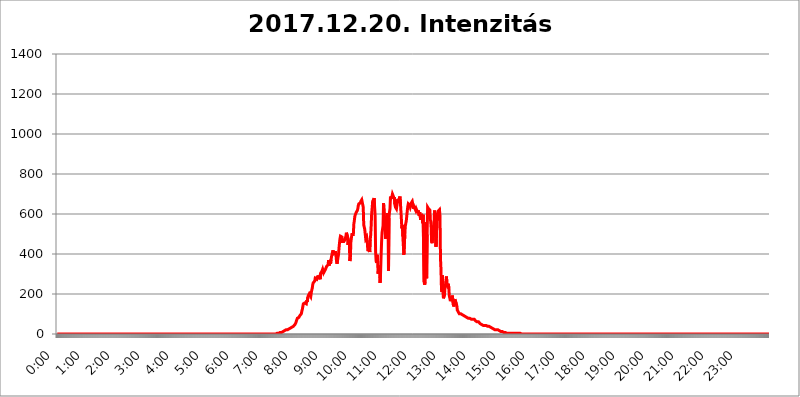
| Category | 2017.12.20. Intenzitás [W/m^2] |
|---|---|
| 0.0 | 0 |
| 0.0006944444444444445 | 0 |
| 0.001388888888888889 | 0 |
| 0.0020833333333333333 | 0 |
| 0.002777777777777778 | 0 |
| 0.003472222222222222 | 0 |
| 0.004166666666666667 | 0 |
| 0.004861111111111111 | 0 |
| 0.005555555555555556 | 0 |
| 0.0062499999999999995 | 0 |
| 0.006944444444444444 | 0 |
| 0.007638888888888889 | 0 |
| 0.008333333333333333 | 0 |
| 0.009027777777777779 | 0 |
| 0.009722222222222222 | 0 |
| 0.010416666666666666 | 0 |
| 0.011111111111111112 | 0 |
| 0.011805555555555555 | 0 |
| 0.012499999999999999 | 0 |
| 0.013194444444444444 | 0 |
| 0.013888888888888888 | 0 |
| 0.014583333333333332 | 0 |
| 0.015277777777777777 | 0 |
| 0.015972222222222224 | 0 |
| 0.016666666666666666 | 0 |
| 0.017361111111111112 | 0 |
| 0.018055555555555557 | 0 |
| 0.01875 | 0 |
| 0.019444444444444445 | 0 |
| 0.02013888888888889 | 0 |
| 0.020833333333333332 | 0 |
| 0.02152777777777778 | 0 |
| 0.022222222222222223 | 0 |
| 0.02291666666666667 | 0 |
| 0.02361111111111111 | 0 |
| 0.024305555555555556 | 0 |
| 0.024999999999999998 | 0 |
| 0.025694444444444447 | 0 |
| 0.02638888888888889 | 0 |
| 0.027083333333333334 | 0 |
| 0.027777777777777776 | 0 |
| 0.02847222222222222 | 0 |
| 0.029166666666666664 | 0 |
| 0.029861111111111113 | 0 |
| 0.030555555555555555 | 0 |
| 0.03125 | 0 |
| 0.03194444444444445 | 0 |
| 0.03263888888888889 | 0 |
| 0.03333333333333333 | 0 |
| 0.034027777777777775 | 0 |
| 0.034722222222222224 | 0 |
| 0.035416666666666666 | 0 |
| 0.036111111111111115 | 0 |
| 0.03680555555555556 | 0 |
| 0.0375 | 0 |
| 0.03819444444444444 | 0 |
| 0.03888888888888889 | 0 |
| 0.03958333333333333 | 0 |
| 0.04027777777777778 | 0 |
| 0.04097222222222222 | 0 |
| 0.041666666666666664 | 0 |
| 0.042361111111111106 | 0 |
| 0.04305555555555556 | 0 |
| 0.043750000000000004 | 0 |
| 0.044444444444444446 | 0 |
| 0.04513888888888889 | 0 |
| 0.04583333333333334 | 0 |
| 0.04652777777777778 | 0 |
| 0.04722222222222222 | 0 |
| 0.04791666666666666 | 0 |
| 0.04861111111111111 | 0 |
| 0.049305555555555554 | 0 |
| 0.049999999999999996 | 0 |
| 0.05069444444444445 | 0 |
| 0.051388888888888894 | 0 |
| 0.052083333333333336 | 0 |
| 0.05277777777777778 | 0 |
| 0.05347222222222222 | 0 |
| 0.05416666666666667 | 0 |
| 0.05486111111111111 | 0 |
| 0.05555555555555555 | 0 |
| 0.05625 | 0 |
| 0.05694444444444444 | 0 |
| 0.057638888888888885 | 0 |
| 0.05833333333333333 | 0 |
| 0.05902777777777778 | 0 |
| 0.059722222222222225 | 0 |
| 0.06041666666666667 | 0 |
| 0.061111111111111116 | 0 |
| 0.06180555555555556 | 0 |
| 0.0625 | 0 |
| 0.06319444444444444 | 0 |
| 0.06388888888888888 | 0 |
| 0.06458333333333334 | 0 |
| 0.06527777777777778 | 0 |
| 0.06597222222222222 | 0 |
| 0.06666666666666667 | 0 |
| 0.06736111111111111 | 0 |
| 0.06805555555555555 | 0 |
| 0.06874999999999999 | 0 |
| 0.06944444444444443 | 0 |
| 0.07013888888888889 | 0 |
| 0.07083333333333333 | 0 |
| 0.07152777777777779 | 0 |
| 0.07222222222222223 | 0 |
| 0.07291666666666667 | 0 |
| 0.07361111111111111 | 0 |
| 0.07430555555555556 | 0 |
| 0.075 | 0 |
| 0.07569444444444444 | 0 |
| 0.0763888888888889 | 0 |
| 0.07708333333333334 | 0 |
| 0.07777777777777778 | 0 |
| 0.07847222222222222 | 0 |
| 0.07916666666666666 | 0 |
| 0.0798611111111111 | 0 |
| 0.08055555555555556 | 0 |
| 0.08125 | 0 |
| 0.08194444444444444 | 0 |
| 0.08263888888888889 | 0 |
| 0.08333333333333333 | 0 |
| 0.08402777777777777 | 0 |
| 0.08472222222222221 | 0 |
| 0.08541666666666665 | 0 |
| 0.08611111111111112 | 0 |
| 0.08680555555555557 | 0 |
| 0.08750000000000001 | 0 |
| 0.08819444444444445 | 0 |
| 0.08888888888888889 | 0 |
| 0.08958333333333333 | 0 |
| 0.09027777777777778 | 0 |
| 0.09097222222222222 | 0 |
| 0.09166666666666667 | 0 |
| 0.09236111111111112 | 0 |
| 0.09305555555555556 | 0 |
| 0.09375 | 0 |
| 0.09444444444444444 | 0 |
| 0.09513888888888888 | 0 |
| 0.09583333333333333 | 0 |
| 0.09652777777777777 | 0 |
| 0.09722222222222222 | 0 |
| 0.09791666666666667 | 0 |
| 0.09861111111111111 | 0 |
| 0.09930555555555555 | 0 |
| 0.09999999999999999 | 0 |
| 0.10069444444444443 | 0 |
| 0.1013888888888889 | 0 |
| 0.10208333333333335 | 0 |
| 0.10277777777777779 | 0 |
| 0.10347222222222223 | 0 |
| 0.10416666666666667 | 0 |
| 0.10486111111111111 | 0 |
| 0.10555555555555556 | 0 |
| 0.10625 | 0 |
| 0.10694444444444444 | 0 |
| 0.1076388888888889 | 0 |
| 0.10833333333333334 | 0 |
| 0.10902777777777778 | 0 |
| 0.10972222222222222 | 0 |
| 0.1111111111111111 | 0 |
| 0.11180555555555556 | 0 |
| 0.11180555555555556 | 0 |
| 0.1125 | 0 |
| 0.11319444444444444 | 0 |
| 0.11388888888888889 | 0 |
| 0.11458333333333333 | 0 |
| 0.11527777777777777 | 0 |
| 0.11597222222222221 | 0 |
| 0.11666666666666665 | 0 |
| 0.1173611111111111 | 0 |
| 0.11805555555555557 | 0 |
| 0.11944444444444445 | 0 |
| 0.12013888888888889 | 0 |
| 0.12083333333333333 | 0 |
| 0.12152777777777778 | 0 |
| 0.12222222222222223 | 0 |
| 0.12291666666666667 | 0 |
| 0.12291666666666667 | 0 |
| 0.12361111111111112 | 0 |
| 0.12430555555555556 | 0 |
| 0.125 | 0 |
| 0.12569444444444444 | 0 |
| 0.12638888888888888 | 0 |
| 0.12708333333333333 | 0 |
| 0.16875 | 0 |
| 0.12847222222222224 | 0 |
| 0.12916666666666668 | 0 |
| 0.12986111111111112 | 0 |
| 0.13055555555555556 | 0 |
| 0.13125 | 0 |
| 0.13194444444444445 | 0 |
| 0.1326388888888889 | 0 |
| 0.13333333333333333 | 0 |
| 0.13402777777777777 | 0 |
| 0.13402777777777777 | 0 |
| 0.13472222222222222 | 0 |
| 0.13541666666666666 | 0 |
| 0.1361111111111111 | 0 |
| 0.13749999999999998 | 0 |
| 0.13819444444444443 | 0 |
| 0.1388888888888889 | 0 |
| 0.13958333333333334 | 0 |
| 0.14027777777777778 | 0 |
| 0.14097222222222222 | 0 |
| 0.14166666666666666 | 0 |
| 0.1423611111111111 | 0 |
| 0.14305555555555557 | 0 |
| 0.14375000000000002 | 0 |
| 0.14444444444444446 | 0 |
| 0.1451388888888889 | 0 |
| 0.1451388888888889 | 0 |
| 0.14652777777777778 | 0 |
| 0.14722222222222223 | 0 |
| 0.14791666666666667 | 0 |
| 0.1486111111111111 | 0 |
| 0.14930555555555555 | 0 |
| 0.15 | 0 |
| 0.15069444444444444 | 0 |
| 0.15138888888888888 | 0 |
| 0.15208333333333332 | 0 |
| 0.15277777777777776 | 0 |
| 0.15347222222222223 | 0 |
| 0.15416666666666667 | 0 |
| 0.15486111111111112 | 0 |
| 0.15555555555555556 | 0 |
| 0.15625 | 0 |
| 0.15694444444444444 | 0 |
| 0.15763888888888888 | 0 |
| 0.15833333333333333 | 0 |
| 0.15902777777777777 | 0 |
| 0.15972222222222224 | 0 |
| 0.16041666666666668 | 0 |
| 0.16111111111111112 | 0 |
| 0.16180555555555556 | 0 |
| 0.1625 | 0 |
| 0.16319444444444445 | 0 |
| 0.1638888888888889 | 0 |
| 0.16458333333333333 | 0 |
| 0.16527777777777777 | 0 |
| 0.16597222222222222 | 0 |
| 0.16666666666666666 | 0 |
| 0.1673611111111111 | 0 |
| 0.16805555555555554 | 0 |
| 0.16874999999999998 | 0 |
| 0.16944444444444443 | 0 |
| 0.17013888888888887 | 0 |
| 0.1708333333333333 | 0 |
| 0.17152777777777775 | 0 |
| 0.17222222222222225 | 0 |
| 0.1729166666666667 | 0 |
| 0.17361111111111113 | 0 |
| 0.17430555555555557 | 0 |
| 0.17500000000000002 | 0 |
| 0.17569444444444446 | 0 |
| 0.1763888888888889 | 0 |
| 0.17708333333333334 | 0 |
| 0.17777777777777778 | 0 |
| 0.17847222222222223 | 0 |
| 0.17916666666666667 | 0 |
| 0.1798611111111111 | 0 |
| 0.18055555555555555 | 0 |
| 0.18125 | 0 |
| 0.18194444444444444 | 0 |
| 0.1826388888888889 | 0 |
| 0.18333333333333335 | 0 |
| 0.1840277777777778 | 0 |
| 0.18472222222222223 | 0 |
| 0.18541666666666667 | 0 |
| 0.18611111111111112 | 0 |
| 0.18680555555555556 | 0 |
| 0.1875 | 0 |
| 0.18819444444444444 | 0 |
| 0.18888888888888888 | 0 |
| 0.18958333333333333 | 0 |
| 0.19027777777777777 | 0 |
| 0.1909722222222222 | 0 |
| 0.19166666666666665 | 0 |
| 0.19236111111111112 | 0 |
| 0.19305555555555554 | 0 |
| 0.19375 | 0 |
| 0.19444444444444445 | 0 |
| 0.1951388888888889 | 0 |
| 0.19583333333333333 | 0 |
| 0.19652777777777777 | 0 |
| 0.19722222222222222 | 0 |
| 0.19791666666666666 | 0 |
| 0.1986111111111111 | 0 |
| 0.19930555555555554 | 0 |
| 0.19999999999999998 | 0 |
| 0.20069444444444443 | 0 |
| 0.20138888888888887 | 0 |
| 0.2020833333333333 | 0 |
| 0.2027777777777778 | 0 |
| 0.2034722222222222 | 0 |
| 0.2041666666666667 | 0 |
| 0.20486111111111113 | 0 |
| 0.20555555555555557 | 0 |
| 0.20625000000000002 | 0 |
| 0.20694444444444446 | 0 |
| 0.2076388888888889 | 0 |
| 0.20833333333333334 | 0 |
| 0.20902777777777778 | 0 |
| 0.20972222222222223 | 0 |
| 0.21041666666666667 | 0 |
| 0.2111111111111111 | 0 |
| 0.21180555555555555 | 0 |
| 0.2125 | 0 |
| 0.21319444444444444 | 0 |
| 0.2138888888888889 | 0 |
| 0.21458333333333335 | 0 |
| 0.2152777777777778 | 0 |
| 0.21597222222222223 | 0 |
| 0.21666666666666667 | 0 |
| 0.21736111111111112 | 0 |
| 0.21805555555555556 | 0 |
| 0.21875 | 0 |
| 0.21944444444444444 | 0 |
| 0.22013888888888888 | 0 |
| 0.22083333333333333 | 0 |
| 0.22152777777777777 | 0 |
| 0.2222222222222222 | 0 |
| 0.22291666666666665 | 0 |
| 0.2236111111111111 | 0 |
| 0.22430555555555556 | 0 |
| 0.225 | 0 |
| 0.22569444444444445 | 0 |
| 0.2263888888888889 | 0 |
| 0.22708333333333333 | 0 |
| 0.22777777777777777 | 0 |
| 0.22847222222222222 | 0 |
| 0.22916666666666666 | 0 |
| 0.2298611111111111 | 0 |
| 0.23055555555555554 | 0 |
| 0.23124999999999998 | 0 |
| 0.23194444444444443 | 0 |
| 0.23263888888888887 | 0 |
| 0.2333333333333333 | 0 |
| 0.2340277777777778 | 0 |
| 0.2347222222222222 | 0 |
| 0.2354166666666667 | 0 |
| 0.23611111111111113 | 0 |
| 0.23680555555555557 | 0 |
| 0.23750000000000002 | 0 |
| 0.23819444444444446 | 0 |
| 0.2388888888888889 | 0 |
| 0.23958333333333334 | 0 |
| 0.24027777777777778 | 0 |
| 0.24097222222222223 | 0 |
| 0.24166666666666667 | 0 |
| 0.2423611111111111 | 0 |
| 0.24305555555555555 | 0 |
| 0.24375 | 0 |
| 0.24444444444444446 | 0 |
| 0.24513888888888888 | 0 |
| 0.24583333333333335 | 0 |
| 0.2465277777777778 | 0 |
| 0.24722222222222223 | 0 |
| 0.24791666666666667 | 0 |
| 0.24861111111111112 | 0 |
| 0.24930555555555556 | 0 |
| 0.25 | 0 |
| 0.25069444444444444 | 0 |
| 0.2513888888888889 | 0 |
| 0.2520833333333333 | 0 |
| 0.25277777777777777 | 0 |
| 0.2534722222222222 | 0 |
| 0.25416666666666665 | 0 |
| 0.2548611111111111 | 0 |
| 0.2555555555555556 | 0 |
| 0.25625000000000003 | 0 |
| 0.2569444444444445 | 0 |
| 0.2576388888888889 | 0 |
| 0.25833333333333336 | 0 |
| 0.2590277777777778 | 0 |
| 0.25972222222222224 | 0 |
| 0.2604166666666667 | 0 |
| 0.2611111111111111 | 0 |
| 0.26180555555555557 | 0 |
| 0.2625 | 0 |
| 0.26319444444444445 | 0 |
| 0.2638888888888889 | 0 |
| 0.26458333333333334 | 0 |
| 0.2652777777777778 | 0 |
| 0.2659722222222222 | 0 |
| 0.26666666666666666 | 0 |
| 0.2673611111111111 | 0 |
| 0.26805555555555555 | 0 |
| 0.26875 | 0 |
| 0.26944444444444443 | 0 |
| 0.2701388888888889 | 0 |
| 0.2708333333333333 | 0 |
| 0.27152777777777776 | 0 |
| 0.2722222222222222 | 0 |
| 0.27291666666666664 | 0 |
| 0.2736111111111111 | 0 |
| 0.2743055555555555 | 0 |
| 0.27499999999999997 | 0 |
| 0.27569444444444446 | 0 |
| 0.27638888888888885 | 0 |
| 0.27708333333333335 | 0 |
| 0.2777777777777778 | 0 |
| 0.27847222222222223 | 0 |
| 0.2791666666666667 | 0 |
| 0.2798611111111111 | 0 |
| 0.28055555555555556 | 0 |
| 0.28125 | 0 |
| 0.28194444444444444 | 0 |
| 0.2826388888888889 | 0 |
| 0.2833333333333333 | 0 |
| 0.28402777777777777 | 0 |
| 0.2847222222222222 | 0 |
| 0.28541666666666665 | 0 |
| 0.28611111111111115 | 0 |
| 0.28680555555555554 | 0 |
| 0.28750000000000003 | 0 |
| 0.2881944444444445 | 0 |
| 0.2888888888888889 | 0 |
| 0.28958333333333336 | 0 |
| 0.2902777777777778 | 0 |
| 0.29097222222222224 | 0 |
| 0.2916666666666667 | 0 |
| 0.2923611111111111 | 0 |
| 0.29305555555555557 | 0 |
| 0.29375 | 0 |
| 0.29444444444444445 | 0 |
| 0.2951388888888889 | 0 |
| 0.29583333333333334 | 0 |
| 0.2965277777777778 | 0 |
| 0.2972222222222222 | 0 |
| 0.29791666666666666 | 0 |
| 0.2986111111111111 | 0 |
| 0.29930555555555555 | 0 |
| 0.3 | 0 |
| 0.30069444444444443 | 0 |
| 0.3013888888888889 | 0 |
| 0.3020833333333333 | 0 |
| 0.30277777777777776 | 0 |
| 0.3034722222222222 | 0 |
| 0.30416666666666664 | 0 |
| 0.3048611111111111 | 0 |
| 0.3055555555555555 | 0 |
| 0.30624999999999997 | 0 |
| 0.3069444444444444 | 0 |
| 0.3076388888888889 | 3.525 |
| 0.30833333333333335 | 3.525 |
| 0.3090277777777778 | 3.525 |
| 0.30972222222222223 | 3.525 |
| 0.3104166666666667 | 3.525 |
| 0.3111111111111111 | 3.525 |
| 0.31180555555555556 | 3.525 |
| 0.3125 | 7.887 |
| 0.31319444444444444 | 7.887 |
| 0.3138888888888889 | 7.887 |
| 0.3145833333333333 | 7.887 |
| 0.31527777777777777 | 7.887 |
| 0.3159722222222222 | 12.257 |
| 0.31666666666666665 | 12.257 |
| 0.31736111111111115 | 12.257 |
| 0.31805555555555554 | 12.257 |
| 0.31875000000000003 | 16.636 |
| 0.3194444444444445 | 16.636 |
| 0.3201388888888889 | 16.636 |
| 0.32083333333333336 | 21.024 |
| 0.3215277777777778 | 21.024 |
| 0.32222222222222224 | 21.024 |
| 0.3229166666666667 | 21.024 |
| 0.3236111111111111 | 25.419 |
| 0.32430555555555557 | 25.419 |
| 0.325 | 25.419 |
| 0.32569444444444445 | 29.823 |
| 0.3263888888888889 | 29.823 |
| 0.32708333333333334 | 29.823 |
| 0.3277777777777778 | 29.823 |
| 0.3284722222222222 | 34.234 |
| 0.32916666666666666 | 34.234 |
| 0.3298611111111111 | 38.653 |
| 0.33055555555555555 | 38.653 |
| 0.33125 | 38.653 |
| 0.33194444444444443 | 43.079 |
| 0.3326388888888889 | 43.079 |
| 0.3333333333333333 | 47.511 |
| 0.3340277777777778 | 51.951 |
| 0.3347222222222222 | 56.398 |
| 0.3354166666666667 | 65.31 |
| 0.3361111111111111 | 65.31 |
| 0.3368055555555556 | 78.722 |
| 0.33749999999999997 | 74.246 |
| 0.33819444444444446 | 83.205 |
| 0.33888888888888885 | 83.205 |
| 0.33958333333333335 | 87.692 |
| 0.34027777777777773 | 92.184 |
| 0.34097222222222223 | 92.184 |
| 0.3416666666666666 | 96.682 |
| 0.3423611111111111 | 101.184 |
| 0.3430555555555555 | 114.716 |
| 0.34375 | 123.758 |
| 0.3444444444444445 | 137.347 |
| 0.3451388888888889 | 150.964 |
| 0.3458333333333334 | 155.509 |
| 0.34652777777777777 | 155.509 |
| 0.34722222222222227 | 155.509 |
| 0.34791666666666665 | 155.509 |
| 0.34861111111111115 | 150.964 |
| 0.34930555555555554 | 150.964 |
| 0.35000000000000003 | 169.156 |
| 0.3506944444444444 | 160.056 |
| 0.3513888888888889 | 182.82 |
| 0.3520833333333333 | 191.937 |
| 0.3527777777777778 | 196.497 |
| 0.3534722222222222 | 201.058 |
| 0.3541666666666667 | 196.497 |
| 0.3548611111111111 | 201.058 |
| 0.35555555555555557 | 187.378 |
| 0.35625 | 205.62 |
| 0.35694444444444445 | 219.309 |
| 0.3576388888888889 | 228.436 |
| 0.35833333333333334 | 246.689 |
| 0.3590277777777778 | 255.813 |
| 0.3597222222222222 | 255.813 |
| 0.36041666666666666 | 251.251 |
| 0.3611111111111111 | 264.932 |
| 0.36180555555555555 | 278.603 |
| 0.3625 | 283.156 |
| 0.36319444444444443 | 283.156 |
| 0.3638888888888889 | 274.047 |
| 0.3645833333333333 | 287.709 |
| 0.3652777777777778 | 278.603 |
| 0.3659722222222222 | 292.259 |
| 0.3666666666666667 | 274.047 |
| 0.3673611111111111 | 278.603 |
| 0.3680555555555556 | 287.709 |
| 0.36874999999999997 | 274.047 |
| 0.36944444444444446 | 301.354 |
| 0.37013888888888885 | 305.898 |
| 0.37083333333333335 | 310.44 |
| 0.37152777777777773 | 314.98 |
| 0.37222222222222223 | 324.052 |
| 0.3729166666666666 | 319.517 |
| 0.3736111111111111 | 305.898 |
| 0.3743055555555555 | 305.898 |
| 0.375 | 301.354 |
| 0.3756944444444445 | 319.517 |
| 0.3763888888888889 | 314.98 |
| 0.3770833333333334 | 324.052 |
| 0.37777777777777777 | 337.639 |
| 0.37847222222222227 | 337.639 |
| 0.37916666666666665 | 333.113 |
| 0.37986111111111115 | 346.682 |
| 0.38055555555555554 | 369.23 |
| 0.38125000000000003 | 342.162 |
| 0.3819444444444444 | 355.712 |
| 0.3826388888888889 | 364.728 |
| 0.3833333333333333 | 351.198 |
| 0.3840277777777778 | 373.729 |
| 0.3847222222222222 | 387.202 |
| 0.3854166666666667 | 400.638 |
| 0.3861111111111111 | 409.574 |
| 0.38680555555555557 | 418.492 |
| 0.3875 | 400.638 |
| 0.38819444444444445 | 400.638 |
| 0.3888888888888889 | 405.108 |
| 0.38958333333333334 | 405.108 |
| 0.3902777777777778 | 414.035 |
| 0.3909722222222222 | 391.685 |
| 0.39166666666666666 | 364.728 |
| 0.3923611111111111 | 351.198 |
| 0.39305555555555555 | 364.728 |
| 0.39375 | 382.715 |
| 0.39444444444444443 | 396.164 |
| 0.3951388888888889 | 427.39 |
| 0.3958333333333333 | 453.968 |
| 0.3965277777777778 | 475.972 |
| 0.3972222222222222 | 489.108 |
| 0.3979166666666667 | 493.475 |
| 0.3986111111111111 | 484.735 |
| 0.3993055555555556 | 484.735 |
| 0.39999999999999997 | 462.786 |
| 0.40069444444444446 | 462.786 |
| 0.40138888888888885 | 467.187 |
| 0.40208333333333335 | 462.786 |
| 0.40277777777777773 | 462.786 |
| 0.40347222222222223 | 471.582 |
| 0.4041666666666666 | 480.356 |
| 0.4048611111111111 | 489.108 |
| 0.4055555555555555 | 506.542 |
| 0.40625 | 506.542 |
| 0.4069444444444445 | 489.108 |
| 0.4076388888888889 | 445.129 |
| 0.4083333333333334 | 445.129 |
| 0.40902777777777777 | 458.38 |
| 0.40972222222222227 | 445.129 |
| 0.41041666666666665 | 364.728 |
| 0.41111111111111115 | 382.715 |
| 0.41180555555555554 | 458.38 |
| 0.41250000000000003 | 462.786 |
| 0.4131944444444444 | 497.836 |
| 0.4138888888888889 | 497.836 |
| 0.4145833333333333 | 502.192 |
| 0.4152777777777778 | 497.836 |
| 0.4159722222222222 | 549.704 |
| 0.4166666666666667 | 566.793 |
| 0.4173611111111111 | 588.009 |
| 0.41805555555555557 | 596.45 |
| 0.41875 | 600.661 |
| 0.41944444444444445 | 609.062 |
| 0.4201388888888889 | 609.062 |
| 0.42083333333333334 | 617.436 |
| 0.4215277777777778 | 625.784 |
| 0.4222222222222222 | 642.4 |
| 0.42291666666666666 | 650.667 |
| 0.4236111111111111 | 646.537 |
| 0.42430555555555555 | 654.791 |
| 0.425 | 654.791 |
| 0.42569444444444443 | 663.019 |
| 0.4263888888888889 | 663.019 |
| 0.4270833333333333 | 671.22 |
| 0.4277777777777778 | 675.311 |
| 0.4284722222222222 | 671.22 |
| 0.4291666666666667 | 634.105 |
| 0.4298611111111111 | 545.416 |
| 0.4305555555555556 | 545.416 |
| 0.43124999999999997 | 523.88 |
| 0.43194444444444446 | 523.88 |
| 0.43263888888888885 | 475.972 |
| 0.43333333333333335 | 480.356 |
| 0.43402777777777773 | 484.735 |
| 0.43472222222222223 | 467.187 |
| 0.4354166666666666 | 427.39 |
| 0.4361111111111111 | 414.035 |
| 0.4368055555555555 | 440.702 |
| 0.4375 | 449.551 |
| 0.4381944444444445 | 409.574 |
| 0.4388888888888889 | 471.582 |
| 0.4395833333333334 | 493.475 |
| 0.44027777777777777 | 541.121 |
| 0.44097222222222227 | 600.661 |
| 0.44166666666666665 | 629.948 |
| 0.44236111111111115 | 663.019 |
| 0.44305555555555554 | 667.123 |
| 0.44375000000000003 | 663.019 |
| 0.4444444444444444 | 679.395 |
| 0.4451388888888889 | 634.105 |
| 0.4458333333333333 | 592.233 |
| 0.4465277777777778 | 409.574 |
| 0.4472222222222222 | 364.728 |
| 0.4479166666666667 | 355.712 |
| 0.4486111111111111 | 396.164 |
| 0.44930555555555557 | 369.23 |
| 0.45 | 301.354 |
| 0.45069444444444445 | 305.898 |
| 0.4513888888888889 | 342.162 |
| 0.45208333333333334 | 314.98 |
| 0.4527777777777778 | 255.813 |
| 0.4534722222222222 | 305.898 |
| 0.45416666666666666 | 387.202 |
| 0.4548611111111111 | 458.38 |
| 0.45555555555555555 | 506.542 |
| 0.45625 | 523.88 |
| 0.45694444444444443 | 541.121 |
| 0.4576388888888889 | 654.791 |
| 0.4583333333333333 | 650.667 |
| 0.4590277777777778 | 575.299 |
| 0.4597222222222222 | 549.704 |
| 0.4604166666666667 | 475.972 |
| 0.4611111111111111 | 528.2 |
| 0.4618055555555556 | 502.192 |
| 0.46249999999999997 | 575.299 |
| 0.46319444444444446 | 604.864 |
| 0.46388888888888885 | 588.009 |
| 0.46458333333333335 | 314.98 |
| 0.46527777777777773 | 579.542 |
| 0.46597222222222223 | 609.062 |
| 0.4666666666666666 | 625.784 |
| 0.4673611111111111 | 687.544 |
| 0.4680555555555555 | 679.395 |
| 0.46875 | 683.473 |
| 0.4694444444444445 | 687.544 |
| 0.4701388888888889 | 699.717 |
| 0.4708333333333334 | 703.762 |
| 0.47152777777777777 | 687.544 |
| 0.47222222222222227 | 675.311 |
| 0.47291666666666665 | 683.473 |
| 0.47361111111111115 | 646.537 |
| 0.47430555555555554 | 634.105 |
| 0.47500000000000003 | 638.256 |
| 0.4756944444444444 | 625.784 |
| 0.4763888888888889 | 642.4 |
| 0.4770833333333333 | 646.537 |
| 0.4777777777777778 | 675.311 |
| 0.4784722222222222 | 654.791 |
| 0.4791666666666667 | 650.667 |
| 0.4798611111111111 | 679.395 |
| 0.48055555555555557 | 687.544 |
| 0.48125 | 658.909 |
| 0.48194444444444445 | 654.791 |
| 0.4826388888888889 | 575.299 |
| 0.48333333333333334 | 528.2 |
| 0.4840277777777778 | 545.416 |
| 0.4847222222222222 | 489.108 |
| 0.48541666666666666 | 489.108 |
| 0.4861111111111111 | 396.164 |
| 0.48680555555555555 | 400.638 |
| 0.4875 | 497.836 |
| 0.48819444444444443 | 541.121 |
| 0.4888888888888889 | 553.986 |
| 0.4895833333333333 | 566.793 |
| 0.4902777777777778 | 592.233 |
| 0.4909722222222222 | 617.436 |
| 0.4916666666666667 | 638.256 |
| 0.4923611111111111 | 650.667 |
| 0.4930555555555556 | 650.667 |
| 0.49374999999999997 | 646.537 |
| 0.49444444444444446 | 642.4 |
| 0.49513888888888885 | 634.105 |
| 0.49583333333333335 | 642.4 |
| 0.49652777777777773 | 654.791 |
| 0.49722222222222223 | 658.909 |
| 0.4979166666666666 | 663.019 |
| 0.4986111111111111 | 650.667 |
| 0.4993055555555555 | 638.256 |
| 0.5 | 625.784 |
| 0.5006944444444444 | 634.105 |
| 0.5013888888888889 | 638.256 |
| 0.5020833333333333 | 629.948 |
| 0.5027777777777778 | 617.436 |
| 0.5034722222222222 | 625.784 |
| 0.5041666666666667 | 621.613 |
| 0.5048611111111111 | 613.252 |
| 0.5055555555555555 | 604.864 |
| 0.50625 | 617.436 |
| 0.5069444444444444 | 617.436 |
| 0.5076388888888889 | 592.233 |
| 0.5083333333333333 | 609.062 |
| 0.5090277777777777 | 609.062 |
| 0.5097222222222222 | 571.049 |
| 0.5104166666666666 | 600.661 |
| 0.5111111111111112 | 600.661 |
| 0.5118055555555555 | 583.779 |
| 0.5125000000000001 | 553.986 |
| 0.5131944444444444 | 596.45 |
| 0.513888888888889 | 596.45 |
| 0.5145833333333333 | 260.373 |
| 0.5152777777777778 | 246.689 |
| 0.5159722222222222 | 260.373 |
| 0.5166666666666667 | 391.685 |
| 0.517361111111111 | 558.261 |
| 0.5180555555555556 | 278.603 |
| 0.5187499999999999 | 497.836 |
| 0.5194444444444445 | 634.105 |
| 0.5201388888888888 | 638.256 |
| 0.5208333333333334 | 625.784 |
| 0.5215277777777778 | 613.252 |
| 0.5222222222222223 | 625.784 |
| 0.5229166666666667 | 575.299 |
| 0.5236111111111111 | 566.793 |
| 0.5243055555555556 | 541.121 |
| 0.525 | 462.786 |
| 0.5256944444444445 | 453.968 |
| 0.5263888888888889 | 475.972 |
| 0.5270833333333333 | 541.121 |
| 0.5277777777777778 | 515.223 |
| 0.5284722222222222 | 558.261 |
| 0.5291666666666667 | 617.436 |
| 0.5298611111111111 | 621.613 |
| 0.5305555555555556 | 617.436 |
| 0.53125 | 436.27 |
| 0.5319444444444444 | 497.836 |
| 0.5326388888888889 | 592.233 |
| 0.5333333333333333 | 600.661 |
| 0.5340277777777778 | 613.252 |
| 0.5347222222222222 | 617.436 |
| 0.5354166666666667 | 613.252 |
| 0.5361111111111111 | 621.613 |
| 0.5368055555555555 | 588.009 |
| 0.5375 | 378.224 |
| 0.5381944444444444 | 324.052 |
| 0.5388888888888889 | 223.873 |
| 0.5395833333333333 | 210.182 |
| 0.5402777777777777 | 292.259 |
| 0.5409722222222222 | 210.182 |
| 0.5416666666666666 | 178.264 |
| 0.5423611111111112 | 182.82 |
| 0.5430555555555555 | 196.497 |
| 0.5437500000000001 | 228.436 |
| 0.5444444444444444 | 242.127 |
| 0.545138888888889 | 242.127 |
| 0.5458333333333333 | 287.709 |
| 0.5465277777777778 | 251.251 |
| 0.5472222222222222 | 233 |
| 0.5479166666666667 | 233 |
| 0.548611111111111 | 251.251 |
| 0.5493055555555556 | 223.873 |
| 0.5499999999999999 | 187.378 |
| 0.5506944444444445 | 178.264 |
| 0.5513888888888888 | 164.605 |
| 0.5520833333333334 | 178.264 |
| 0.5527777777777778 | 164.605 |
| 0.5534722222222223 | 160.056 |
| 0.5541666666666667 | 191.937 |
| 0.5548611111111111 | 191.937 |
| 0.5555555555555556 | 146.423 |
| 0.55625 | 137.347 |
| 0.5569444444444445 | 155.509 |
| 0.5576388888888889 | 173.709 |
| 0.5583333333333333 | 173.709 |
| 0.5590277777777778 | 178.264 |
| 0.5597222222222222 | 150.964 |
| 0.5604166666666667 | 141.884 |
| 0.5611111111111111 | 119.235 |
| 0.5618055555555556 | 114.716 |
| 0.5625 | 110.201 |
| 0.5631944444444444 | 105.69 |
| 0.5638888888888889 | 101.184 |
| 0.5645833333333333 | 96.682 |
| 0.5652777777777778 | 96.682 |
| 0.5659722222222222 | 101.184 |
| 0.5666666666666667 | 96.682 |
| 0.5673611111111111 | 96.682 |
| 0.5680555555555555 | 96.682 |
| 0.56875 | 96.682 |
| 0.5694444444444444 | 96.682 |
| 0.5701388888888889 | 92.184 |
| 0.5708333333333333 | 92.184 |
| 0.5715277777777777 | 92.184 |
| 0.5722222222222222 | 87.692 |
| 0.5729166666666666 | 87.692 |
| 0.5736111111111112 | 87.692 |
| 0.5743055555555555 | 83.205 |
| 0.5750000000000001 | 83.205 |
| 0.5756944444444444 | 83.205 |
| 0.576388888888889 | 78.722 |
| 0.5770833333333333 | 78.722 |
| 0.5777777777777778 | 78.722 |
| 0.5784722222222222 | 78.722 |
| 0.5791666666666667 | 74.246 |
| 0.579861111111111 | 74.246 |
| 0.5805555555555556 | 74.246 |
| 0.5812499999999999 | 74.246 |
| 0.5819444444444445 | 74.246 |
| 0.5826388888888888 | 74.246 |
| 0.5833333333333334 | 74.246 |
| 0.5840277777777778 | 74.246 |
| 0.5847222222222223 | 74.246 |
| 0.5854166666666667 | 69.775 |
| 0.5861111111111111 | 69.775 |
| 0.5868055555555556 | 65.31 |
| 0.5875 | 65.31 |
| 0.5881944444444445 | 65.31 |
| 0.5888888888888889 | 60.85 |
| 0.5895833333333333 | 60.85 |
| 0.5902777777777778 | 60.85 |
| 0.5909722222222222 | 60.85 |
| 0.5916666666666667 | 60.85 |
| 0.5923611111111111 | 56.398 |
| 0.5930555555555556 | 51.951 |
| 0.59375 | 47.511 |
| 0.5944444444444444 | 47.511 |
| 0.5951388888888889 | 47.511 |
| 0.5958333333333333 | 43.079 |
| 0.5965277777777778 | 43.079 |
| 0.5972222222222222 | 43.079 |
| 0.5979166666666667 | 43.079 |
| 0.5986111111111111 | 43.079 |
| 0.5993055555555555 | 43.079 |
| 0.6 | 43.079 |
| 0.6006944444444444 | 43.079 |
| 0.6013888888888889 | 43.079 |
| 0.6020833333333333 | 38.653 |
| 0.6027777777777777 | 38.653 |
| 0.6034722222222222 | 38.653 |
| 0.6041666666666666 | 38.653 |
| 0.6048611111111112 | 38.653 |
| 0.6055555555555555 | 38.653 |
| 0.6062500000000001 | 38.653 |
| 0.6069444444444444 | 34.234 |
| 0.607638888888889 | 34.234 |
| 0.6083333333333333 | 29.823 |
| 0.6090277777777778 | 29.823 |
| 0.6097222222222222 | 29.823 |
| 0.6104166666666667 | 25.419 |
| 0.611111111111111 | 25.419 |
| 0.6118055555555556 | 25.419 |
| 0.6124999999999999 | 21.024 |
| 0.6131944444444445 | 21.024 |
| 0.6138888888888888 | 21.024 |
| 0.6145833333333334 | 21.024 |
| 0.6152777777777778 | 21.024 |
| 0.6159722222222223 | 21.024 |
| 0.6166666666666667 | 21.024 |
| 0.6173611111111111 | 21.024 |
| 0.6180555555555556 | 21.024 |
| 0.61875 | 16.636 |
| 0.6194444444444445 | 16.636 |
| 0.6201388888888889 | 16.636 |
| 0.6208333333333333 | 16.636 |
| 0.6215277777777778 | 12.257 |
| 0.6222222222222222 | 12.257 |
| 0.6229166666666667 | 12.257 |
| 0.6236111111111111 | 12.257 |
| 0.6243055555555556 | 12.257 |
| 0.625 | 12.257 |
| 0.6256944444444444 | 12.257 |
| 0.6263888888888889 | 7.887 |
| 0.6270833333333333 | 7.887 |
| 0.6277777777777778 | 7.887 |
| 0.6284722222222222 | 7.887 |
| 0.6291666666666667 | 7.887 |
| 0.6298611111111111 | 3.525 |
| 0.6305555555555555 | 3.525 |
| 0.63125 | 3.525 |
| 0.6319444444444444 | 3.525 |
| 0.6326388888888889 | 3.525 |
| 0.6333333333333333 | 3.525 |
| 0.6340277777777777 | 3.525 |
| 0.6347222222222222 | 3.525 |
| 0.6354166666666666 | 3.525 |
| 0.6361111111111112 | 3.525 |
| 0.6368055555555555 | 3.525 |
| 0.6375000000000001 | 3.525 |
| 0.6381944444444444 | 3.525 |
| 0.638888888888889 | 3.525 |
| 0.6395833333333333 | 3.525 |
| 0.6402777777777778 | 3.525 |
| 0.6409722222222222 | 3.525 |
| 0.6416666666666667 | 3.525 |
| 0.642361111111111 | 3.525 |
| 0.6430555555555556 | 3.525 |
| 0.6437499999999999 | 3.525 |
| 0.6444444444444445 | 3.525 |
| 0.6451388888888888 | 3.525 |
| 0.6458333333333334 | 3.525 |
| 0.6465277777777778 | 3.525 |
| 0.6472222222222223 | 3.525 |
| 0.6479166666666667 | 3.525 |
| 0.6486111111111111 | 3.525 |
| 0.6493055555555556 | 3.525 |
| 0.65 | 0 |
| 0.6506944444444445 | 0 |
| 0.6513888888888889 | 0 |
| 0.6520833333333333 | 0 |
| 0.6527777777777778 | 0 |
| 0.6534722222222222 | 0 |
| 0.6541666666666667 | 0 |
| 0.6548611111111111 | 0 |
| 0.6555555555555556 | 0 |
| 0.65625 | 0 |
| 0.6569444444444444 | 0 |
| 0.6576388888888889 | 0 |
| 0.6583333333333333 | 0 |
| 0.6590277777777778 | 0 |
| 0.6597222222222222 | 0 |
| 0.6604166666666667 | 0 |
| 0.6611111111111111 | 0 |
| 0.6618055555555555 | 0 |
| 0.6625 | 0 |
| 0.6631944444444444 | 0 |
| 0.6638888888888889 | 0 |
| 0.6645833333333333 | 0 |
| 0.6652777777777777 | 0 |
| 0.6659722222222222 | 0 |
| 0.6666666666666666 | 0 |
| 0.6673611111111111 | 0 |
| 0.6680555555555556 | 0 |
| 0.6687500000000001 | 0 |
| 0.6694444444444444 | 0 |
| 0.6701388888888888 | 0 |
| 0.6708333333333334 | 0 |
| 0.6715277777777778 | 0 |
| 0.6722222222222222 | 0 |
| 0.6729166666666666 | 0 |
| 0.6736111111111112 | 0 |
| 0.6743055555555556 | 0 |
| 0.6749999999999999 | 0 |
| 0.6756944444444444 | 0 |
| 0.6763888888888889 | 0 |
| 0.6770833333333334 | 0 |
| 0.6777777777777777 | 0 |
| 0.6784722222222223 | 0 |
| 0.6791666666666667 | 0 |
| 0.6798611111111111 | 0 |
| 0.6805555555555555 | 0 |
| 0.68125 | 0 |
| 0.6819444444444445 | 0 |
| 0.6826388888888889 | 0 |
| 0.6833333333333332 | 0 |
| 0.6840277777777778 | 0 |
| 0.6847222222222222 | 0 |
| 0.6854166666666667 | 0 |
| 0.686111111111111 | 0 |
| 0.6868055555555556 | 0 |
| 0.6875 | 0 |
| 0.6881944444444444 | 0 |
| 0.688888888888889 | 0 |
| 0.6895833333333333 | 0 |
| 0.6902777777777778 | 0 |
| 0.6909722222222222 | 0 |
| 0.6916666666666668 | 0 |
| 0.6923611111111111 | 0 |
| 0.6930555555555555 | 0 |
| 0.69375 | 0 |
| 0.6944444444444445 | 0 |
| 0.6951388888888889 | 0 |
| 0.6958333333333333 | 0 |
| 0.6965277777777777 | 0 |
| 0.6972222222222223 | 0 |
| 0.6979166666666666 | 0 |
| 0.6986111111111111 | 0 |
| 0.6993055555555556 | 0 |
| 0.7000000000000001 | 0 |
| 0.7006944444444444 | 0 |
| 0.7013888888888888 | 0 |
| 0.7020833333333334 | 0 |
| 0.7027777777777778 | 0 |
| 0.7034722222222222 | 0 |
| 0.7041666666666666 | 0 |
| 0.7048611111111112 | 0 |
| 0.7055555555555556 | 0 |
| 0.7062499999999999 | 0 |
| 0.7069444444444444 | 0 |
| 0.7076388888888889 | 0 |
| 0.7083333333333334 | 0 |
| 0.7090277777777777 | 0 |
| 0.7097222222222223 | 0 |
| 0.7104166666666667 | 0 |
| 0.7111111111111111 | 0 |
| 0.7118055555555555 | 0 |
| 0.7125 | 0 |
| 0.7131944444444445 | 0 |
| 0.7138888888888889 | 0 |
| 0.7145833333333332 | 0 |
| 0.7152777777777778 | 0 |
| 0.7159722222222222 | 0 |
| 0.7166666666666667 | 0 |
| 0.717361111111111 | 0 |
| 0.7180555555555556 | 0 |
| 0.71875 | 0 |
| 0.7194444444444444 | 0 |
| 0.720138888888889 | 0 |
| 0.7208333333333333 | 0 |
| 0.7215277777777778 | 0 |
| 0.7222222222222222 | 0 |
| 0.7229166666666668 | 0 |
| 0.7236111111111111 | 0 |
| 0.7243055555555555 | 0 |
| 0.725 | 0 |
| 0.7256944444444445 | 0 |
| 0.7263888888888889 | 0 |
| 0.7270833333333333 | 0 |
| 0.7277777777777777 | 0 |
| 0.7284722222222223 | 0 |
| 0.7291666666666666 | 0 |
| 0.7298611111111111 | 0 |
| 0.7305555555555556 | 0 |
| 0.7312500000000001 | 0 |
| 0.7319444444444444 | 0 |
| 0.7326388888888888 | 0 |
| 0.7333333333333334 | 0 |
| 0.7340277777777778 | 0 |
| 0.7347222222222222 | 0 |
| 0.7354166666666666 | 0 |
| 0.7361111111111112 | 0 |
| 0.7368055555555556 | 0 |
| 0.7374999999999999 | 0 |
| 0.7381944444444444 | 0 |
| 0.7388888888888889 | 0 |
| 0.7395833333333334 | 0 |
| 0.7402777777777777 | 0 |
| 0.7409722222222223 | 0 |
| 0.7416666666666667 | 0 |
| 0.7423611111111111 | 0 |
| 0.7430555555555555 | 0 |
| 0.74375 | 0 |
| 0.7444444444444445 | 0 |
| 0.7451388888888889 | 0 |
| 0.7458333333333332 | 0 |
| 0.7465277777777778 | 0 |
| 0.7472222222222222 | 0 |
| 0.7479166666666667 | 0 |
| 0.748611111111111 | 0 |
| 0.7493055555555556 | 0 |
| 0.75 | 0 |
| 0.7506944444444444 | 0 |
| 0.751388888888889 | 0 |
| 0.7520833333333333 | 0 |
| 0.7527777777777778 | 0 |
| 0.7534722222222222 | 0 |
| 0.7541666666666668 | 0 |
| 0.7548611111111111 | 0 |
| 0.7555555555555555 | 0 |
| 0.75625 | 0 |
| 0.7569444444444445 | 0 |
| 0.7576388888888889 | 0 |
| 0.7583333333333333 | 0 |
| 0.7590277777777777 | 0 |
| 0.7597222222222223 | 0 |
| 0.7604166666666666 | 0 |
| 0.7611111111111111 | 0 |
| 0.7618055555555556 | 0 |
| 0.7625000000000001 | 0 |
| 0.7631944444444444 | 0 |
| 0.7638888888888888 | 0 |
| 0.7645833333333334 | 0 |
| 0.7652777777777778 | 0 |
| 0.7659722222222222 | 0 |
| 0.7666666666666666 | 0 |
| 0.7673611111111112 | 0 |
| 0.7680555555555556 | 0 |
| 0.7687499999999999 | 0 |
| 0.7694444444444444 | 0 |
| 0.7701388888888889 | 0 |
| 0.7708333333333334 | 0 |
| 0.7715277777777777 | 0 |
| 0.7722222222222223 | 0 |
| 0.7729166666666667 | 0 |
| 0.7736111111111111 | 0 |
| 0.7743055555555555 | 0 |
| 0.775 | 0 |
| 0.7756944444444445 | 0 |
| 0.7763888888888889 | 0 |
| 0.7770833333333332 | 0 |
| 0.7777777777777778 | 0 |
| 0.7784722222222222 | 0 |
| 0.7791666666666667 | 0 |
| 0.779861111111111 | 0 |
| 0.7805555555555556 | 0 |
| 0.78125 | 0 |
| 0.7819444444444444 | 0 |
| 0.782638888888889 | 0 |
| 0.7833333333333333 | 0 |
| 0.7840277777777778 | 0 |
| 0.7847222222222222 | 0 |
| 0.7854166666666668 | 0 |
| 0.7861111111111111 | 0 |
| 0.7868055555555555 | 0 |
| 0.7875 | 0 |
| 0.7881944444444445 | 0 |
| 0.7888888888888889 | 0 |
| 0.7895833333333333 | 0 |
| 0.7902777777777777 | 0 |
| 0.7909722222222223 | 0 |
| 0.7916666666666666 | 0 |
| 0.7923611111111111 | 0 |
| 0.7930555555555556 | 0 |
| 0.7937500000000001 | 0 |
| 0.7944444444444444 | 0 |
| 0.7951388888888888 | 0 |
| 0.7958333333333334 | 0 |
| 0.7965277777777778 | 0 |
| 0.7972222222222222 | 0 |
| 0.7979166666666666 | 0 |
| 0.7986111111111112 | 0 |
| 0.7993055555555556 | 0 |
| 0.7999999999999999 | 0 |
| 0.8006944444444444 | 0 |
| 0.8013888888888889 | 0 |
| 0.8020833333333334 | 0 |
| 0.8027777777777777 | 0 |
| 0.8034722222222223 | 0 |
| 0.8041666666666667 | 0 |
| 0.8048611111111111 | 0 |
| 0.8055555555555555 | 0 |
| 0.80625 | 0 |
| 0.8069444444444445 | 0 |
| 0.8076388888888889 | 0 |
| 0.8083333333333332 | 0 |
| 0.8090277777777778 | 0 |
| 0.8097222222222222 | 0 |
| 0.8104166666666667 | 0 |
| 0.811111111111111 | 0 |
| 0.8118055555555556 | 0 |
| 0.8125 | 0 |
| 0.8131944444444444 | 0 |
| 0.813888888888889 | 0 |
| 0.8145833333333333 | 0 |
| 0.8152777777777778 | 0 |
| 0.8159722222222222 | 0 |
| 0.8166666666666668 | 0 |
| 0.8173611111111111 | 0 |
| 0.8180555555555555 | 0 |
| 0.81875 | 0 |
| 0.8194444444444445 | 0 |
| 0.8201388888888889 | 0 |
| 0.8208333333333333 | 0 |
| 0.8215277777777777 | 0 |
| 0.8222222222222223 | 0 |
| 0.8229166666666666 | 0 |
| 0.8236111111111111 | 0 |
| 0.8243055555555556 | 0 |
| 0.8250000000000001 | 0 |
| 0.8256944444444444 | 0 |
| 0.8263888888888888 | 0 |
| 0.8270833333333334 | 0 |
| 0.8277777777777778 | 0 |
| 0.8284722222222222 | 0 |
| 0.8291666666666666 | 0 |
| 0.8298611111111112 | 0 |
| 0.8305555555555556 | 0 |
| 0.8312499999999999 | 0 |
| 0.8319444444444444 | 0 |
| 0.8326388888888889 | 0 |
| 0.8333333333333334 | 0 |
| 0.8340277777777777 | 0 |
| 0.8347222222222223 | 0 |
| 0.8354166666666667 | 0 |
| 0.8361111111111111 | 0 |
| 0.8368055555555555 | 0 |
| 0.8375 | 0 |
| 0.8381944444444445 | 0 |
| 0.8388888888888889 | 0 |
| 0.8395833333333332 | 0 |
| 0.8402777777777778 | 0 |
| 0.8409722222222222 | 0 |
| 0.8416666666666667 | 0 |
| 0.842361111111111 | 0 |
| 0.8430555555555556 | 0 |
| 0.84375 | 0 |
| 0.8444444444444444 | 0 |
| 0.845138888888889 | 0 |
| 0.8458333333333333 | 0 |
| 0.8465277777777778 | 0 |
| 0.8472222222222222 | 0 |
| 0.8479166666666668 | 0 |
| 0.8486111111111111 | 0 |
| 0.8493055555555555 | 0 |
| 0.85 | 0 |
| 0.8506944444444445 | 0 |
| 0.8513888888888889 | 0 |
| 0.8520833333333333 | 0 |
| 0.8527777777777777 | 0 |
| 0.8534722222222223 | 0 |
| 0.8541666666666666 | 0 |
| 0.8548611111111111 | 0 |
| 0.8555555555555556 | 0 |
| 0.8562500000000001 | 0 |
| 0.8569444444444444 | 0 |
| 0.8576388888888888 | 0 |
| 0.8583333333333334 | 0 |
| 0.8590277777777778 | 0 |
| 0.8597222222222222 | 0 |
| 0.8604166666666666 | 0 |
| 0.8611111111111112 | 0 |
| 0.8618055555555556 | 0 |
| 0.8624999999999999 | 0 |
| 0.8631944444444444 | 0 |
| 0.8638888888888889 | 0 |
| 0.8645833333333334 | 0 |
| 0.8652777777777777 | 0 |
| 0.8659722222222223 | 0 |
| 0.8666666666666667 | 0 |
| 0.8673611111111111 | 0 |
| 0.8680555555555555 | 0 |
| 0.86875 | 0 |
| 0.8694444444444445 | 0 |
| 0.8701388888888889 | 0 |
| 0.8708333333333332 | 0 |
| 0.8715277777777778 | 0 |
| 0.8722222222222222 | 0 |
| 0.8729166666666667 | 0 |
| 0.873611111111111 | 0 |
| 0.8743055555555556 | 0 |
| 0.875 | 0 |
| 0.8756944444444444 | 0 |
| 0.876388888888889 | 0 |
| 0.8770833333333333 | 0 |
| 0.8777777777777778 | 0 |
| 0.8784722222222222 | 0 |
| 0.8791666666666668 | 0 |
| 0.8798611111111111 | 0 |
| 0.8805555555555555 | 0 |
| 0.88125 | 0 |
| 0.8819444444444445 | 0 |
| 0.8826388888888889 | 0 |
| 0.8833333333333333 | 0 |
| 0.8840277777777777 | 0 |
| 0.8847222222222223 | 0 |
| 0.8854166666666666 | 0 |
| 0.8861111111111111 | 0 |
| 0.8868055555555556 | 0 |
| 0.8875000000000001 | 0 |
| 0.8881944444444444 | 0 |
| 0.8888888888888888 | 0 |
| 0.8895833333333334 | 0 |
| 0.8902777777777778 | 0 |
| 0.8909722222222222 | 0 |
| 0.8916666666666666 | 0 |
| 0.8923611111111112 | 0 |
| 0.8930555555555556 | 0 |
| 0.8937499999999999 | 0 |
| 0.8944444444444444 | 0 |
| 0.8951388888888889 | 0 |
| 0.8958333333333334 | 0 |
| 0.8965277777777777 | 0 |
| 0.8972222222222223 | 0 |
| 0.8979166666666667 | 0 |
| 0.8986111111111111 | 0 |
| 0.8993055555555555 | 0 |
| 0.9 | 0 |
| 0.9006944444444445 | 0 |
| 0.9013888888888889 | 0 |
| 0.9020833333333332 | 0 |
| 0.9027777777777778 | 0 |
| 0.9034722222222222 | 0 |
| 0.9041666666666667 | 0 |
| 0.904861111111111 | 0 |
| 0.9055555555555556 | 0 |
| 0.90625 | 0 |
| 0.9069444444444444 | 0 |
| 0.907638888888889 | 0 |
| 0.9083333333333333 | 0 |
| 0.9090277777777778 | 0 |
| 0.9097222222222222 | 0 |
| 0.9104166666666668 | 0 |
| 0.9111111111111111 | 0 |
| 0.9118055555555555 | 0 |
| 0.9125 | 0 |
| 0.9131944444444445 | 0 |
| 0.9138888888888889 | 0 |
| 0.9145833333333333 | 0 |
| 0.9152777777777777 | 0 |
| 0.9159722222222223 | 0 |
| 0.9166666666666666 | 0 |
| 0.9173611111111111 | 0 |
| 0.9180555555555556 | 0 |
| 0.9187500000000001 | 0 |
| 0.9194444444444444 | 0 |
| 0.9201388888888888 | 0 |
| 0.9208333333333334 | 0 |
| 0.9215277777777778 | 0 |
| 0.9222222222222222 | 0 |
| 0.9229166666666666 | 0 |
| 0.9236111111111112 | 0 |
| 0.9243055555555556 | 0 |
| 0.9249999999999999 | 0 |
| 0.9256944444444444 | 0 |
| 0.9263888888888889 | 0 |
| 0.9270833333333334 | 0 |
| 0.9277777777777777 | 0 |
| 0.9284722222222223 | 0 |
| 0.9291666666666667 | 0 |
| 0.9298611111111111 | 0 |
| 0.9305555555555555 | 0 |
| 0.93125 | 0 |
| 0.9319444444444445 | 0 |
| 0.9326388888888889 | 0 |
| 0.9333333333333332 | 0 |
| 0.9340277777777778 | 0 |
| 0.9347222222222222 | 0 |
| 0.9354166666666667 | 0 |
| 0.936111111111111 | 0 |
| 0.9368055555555556 | 0 |
| 0.9375 | 0 |
| 0.9381944444444444 | 0 |
| 0.938888888888889 | 0 |
| 0.9395833333333333 | 0 |
| 0.9402777777777778 | 0 |
| 0.9409722222222222 | 0 |
| 0.9416666666666668 | 0 |
| 0.9423611111111111 | 0 |
| 0.9430555555555555 | 0 |
| 0.94375 | 0 |
| 0.9444444444444445 | 0 |
| 0.9451388888888889 | 0 |
| 0.9458333333333333 | 0 |
| 0.9465277777777777 | 0 |
| 0.9472222222222223 | 0 |
| 0.9479166666666666 | 0 |
| 0.9486111111111111 | 0 |
| 0.9493055555555556 | 0 |
| 0.9500000000000001 | 0 |
| 0.9506944444444444 | 0 |
| 0.9513888888888888 | 0 |
| 0.9520833333333334 | 0 |
| 0.9527777777777778 | 0 |
| 0.9534722222222222 | 0 |
| 0.9541666666666666 | 0 |
| 0.9548611111111112 | 0 |
| 0.9555555555555556 | 0 |
| 0.9562499999999999 | 0 |
| 0.9569444444444444 | 0 |
| 0.9576388888888889 | 0 |
| 0.9583333333333334 | 0 |
| 0.9590277777777777 | 0 |
| 0.9597222222222223 | 0 |
| 0.9604166666666667 | 0 |
| 0.9611111111111111 | 0 |
| 0.9618055555555555 | 0 |
| 0.9625 | 0 |
| 0.9631944444444445 | 0 |
| 0.9638888888888889 | 0 |
| 0.9645833333333332 | 0 |
| 0.9652777777777778 | 0 |
| 0.9659722222222222 | 0 |
| 0.9666666666666667 | 0 |
| 0.967361111111111 | 0 |
| 0.9680555555555556 | 0 |
| 0.96875 | 0 |
| 0.9694444444444444 | 0 |
| 0.970138888888889 | 0 |
| 0.9708333333333333 | 0 |
| 0.9715277777777778 | 0 |
| 0.9722222222222222 | 0 |
| 0.9729166666666668 | 0 |
| 0.9736111111111111 | 0 |
| 0.9743055555555555 | 0 |
| 0.975 | 0 |
| 0.9756944444444445 | 0 |
| 0.9763888888888889 | 0 |
| 0.9770833333333333 | 0 |
| 0.9777777777777777 | 0 |
| 0.9784722222222223 | 0 |
| 0.9791666666666666 | 0 |
| 0.9798611111111111 | 0 |
| 0.9805555555555556 | 0 |
| 0.9812500000000001 | 0 |
| 0.9819444444444444 | 0 |
| 0.9826388888888888 | 0 |
| 0.9833333333333334 | 0 |
| 0.9840277777777778 | 0 |
| 0.9847222222222222 | 0 |
| 0.9854166666666666 | 0 |
| 0.9861111111111112 | 0 |
| 0.9868055555555556 | 0 |
| 0.9874999999999999 | 0 |
| 0.9881944444444444 | 0 |
| 0.9888888888888889 | 0 |
| 0.9895833333333334 | 0 |
| 0.9902777777777777 | 0 |
| 0.9909722222222223 | 0 |
| 0.9916666666666667 | 0 |
| 0.9923611111111111 | 0 |
| 0.9930555555555555 | 0 |
| 0.99375 | 0 |
| 0.9944444444444445 | 0 |
| 0.9951388888888889 | 0 |
| 0.9958333333333332 | 0 |
| 0.9965277777777778 | 0 |
| 0.9972222222222222 | 0 |
| 0.9979166666666667 | 0 |
| 0.998611111111111 | 0 |
| 0.9993055555555556 | 0 |